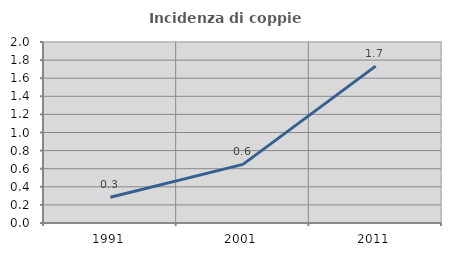
| Category | Incidenza di coppie miste |
|---|---|
| 1991.0 | 0.284 |
| 2001.0 | 0.648 |
| 2011.0 | 1.733 |